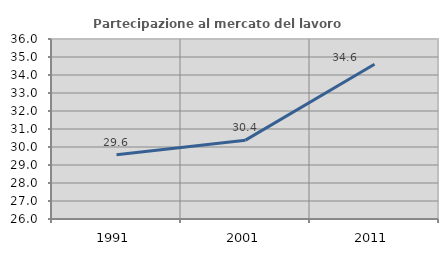
| Category | Partecipazione al mercato del lavoro  femminile |
|---|---|
| 1991.0 | 29.574 |
| 2001.0 | 30.381 |
| 2011.0 | 34.598 |